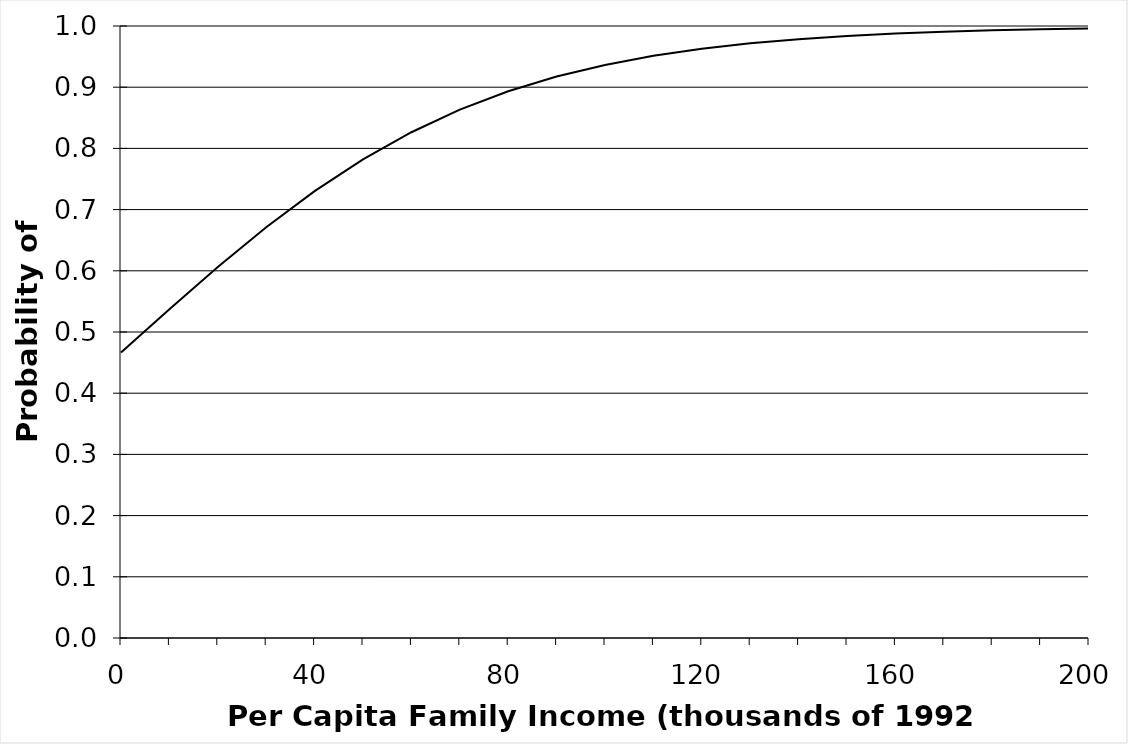
| Category | Series 0 |
|---|---|
| 0.0 | 0.467 |
| 10.0 | 0.537 |
| 20.0 | 0.606 |
| 30.0 | 0.671 |
| 40.0 | 0.73 |
| 50.0 | 0.782 |
| 60.0 | 0.826 |
| 70.0 | 0.863 |
| 80.0 | 0.893 |
| 90.0 | 0.917 |
| 100.0 | 0.936 |
| 110.0 | 0.951 |
| 120.0 | 0.963 |
| 130.0 | 0.972 |
| 140.0 | 0.979 |
| 150.0 | 0.984 |
| 160.0 | 0.988 |
| 170.0 | 0.991 |
| 180.0 | 0.993 |
| 190.0 | 0.995 |
| 200.0 | 0.996 |